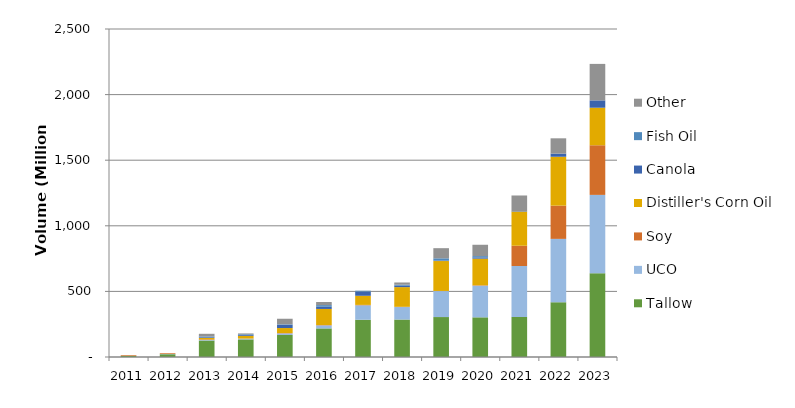
| Category | Tallow | UCO | Soy | Distiller's Corn Oil | Canola | Fish Oil | Other |
|---|---|---|---|---|---|---|---|
| 2011.0 | 8.844 | 0.115 | 5.155 | 0.173 | 0.038 | 0 | 0.015 |
| 2012.0 | 21.131 | 1.933 | 5.475 | 0.073 | 0.178 | 0 | 0 |
| 2013.0 | 125.739 | 4.242 | 4.4 | 10.904 | 5.273 | 6.086 | 20.196 |
| 2014.0 | 134.125 | 5.728 | 0.754 | 20.274 | 6.183 | 6.159 | 6.421 |
| 2015.0 | 167.6 | 12.59 | 2.433 | 38.087 | 24.392 | 4.126 | 42.377 |
| 2016.0 | 217.982 | 23.092 | 2.42 | 122.768 | 17.012 | 12.309 | 23.437 |
| 2017.0 | 283.784 | 110.297 | 3.042 | 69.479 | 32.015 | 6.525 | 0.089 |
| 2018.0 | 285.524 | 95.195 | 1.97 | 149.887 | 10.577 | 7.918 | 16.922 |
| 2019.0 | 304.496 | 198.153 | 0.684 | 228.087 | 3.847 | 16.955 | 77.234 |
| 2020.0 | 302.36 | 241.074 | 3.179 | 203.155 | 9.426 | 9.85 | 86.392 |
| 2021.0 | 305.516 | 388.241 | 154.318 | 260.375 | 3.282 | 0 | 119.347 |
| 2022.0 | 418.093 | 482.258 | 253.285 | 372.682 | 23.792 | 0 | 116.734 |
| 2023.0 | 638.068 | 597.44 | 378.39 | 286.163 | 55.856 | 0 | 278.135 |